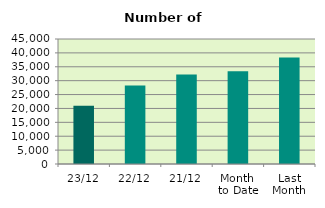
| Category | Series 0 |
|---|---|
| 23/12 | 20948 |
| 22/12 | 28242 |
| 21/12 | 32244 |
| Month 
to Date | 33395.412 |
| Last
Month | 38326.182 |